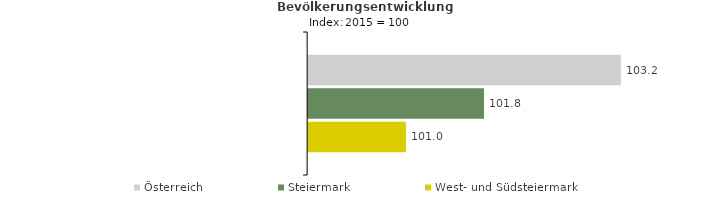
| Category | Österreich | Steiermark | West- und Südsteiermark |
|---|---|---|---|
| 2019.0 | 103.2 | 101.8 | 101 |